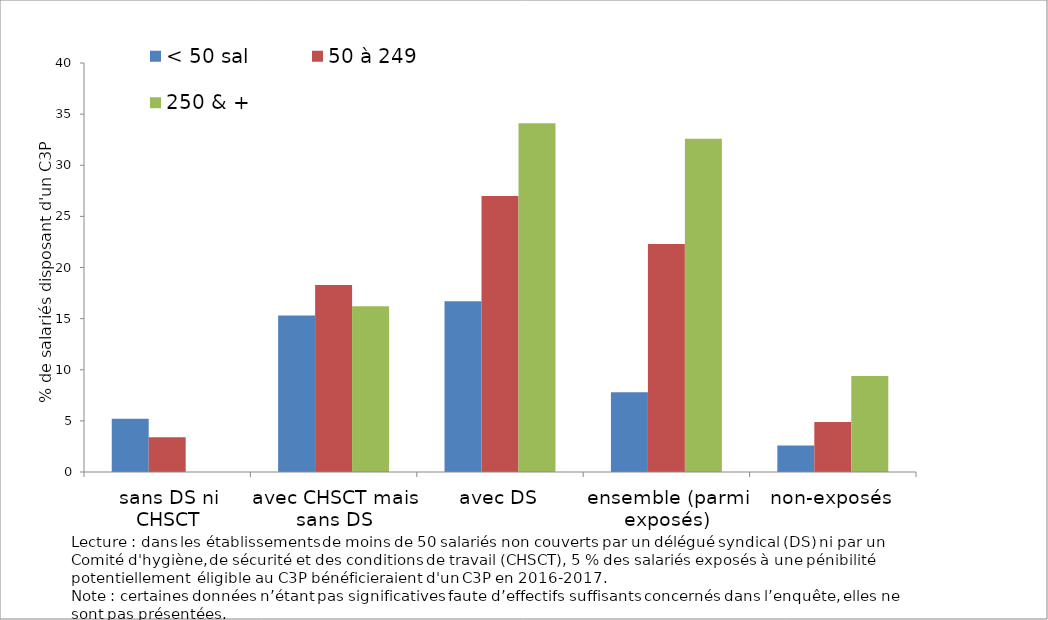
| Category | < 50 sal | 50 à 249 | 250 & + |
|---|---|---|---|
| sans DS ni CHSCT | 5.2 | 3.4 | 0 |
| avec CHSCT mais sans DS | 15.3 | 18.3 | 16.2 |
| avec DS | 16.7 | 27 | 34.1 |
| ensemble (parmi exposés) | 7.8 | 22.3 | 32.6 |
| non-exposés | 2.6 | 4.9 | 9.4 |